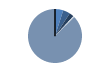
| Category | Series 0 |
|---|---|
| ARRASTRE | 51 |
| CERCO | 44 |
| PALANGRE | 28 |
| REDES DE ENMALLE | 5 |
| ARTES FIJAS | 3 |
| ARTES MENORES | 901 |
| SIN TIPO ASIGNADO | 0 |